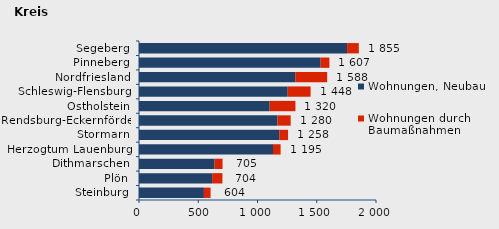
| Category | Wohnungen, Neubau | Wohnungen durch Baumaßnahmen | Series 2 |
|---|---|---|---|
| Steinburg | 548 | 56 | 604 |
| Plön | 617 | 87 | 704 |
| Dithmarschen | 638 | 67 | 705 |
| Herzogtum Lauenburg | 1131 | 64 | 1195 |
| Stormarn | 1184 | 74 | 1258 |
| Rendsburg-Eckernförde | 1169 | 111 | 1280 |
| Ostholstein | 1103 | 217 | 1320 |
| Schleswig-Flensburg | 1255 | 193 | 1448 |
| Nordfriesland | 1319 | 269 | 1588 |
| Pinneberg | 1533 | 74 | 1607 |
| Segeberg | 1756 | 99 | 1855 |